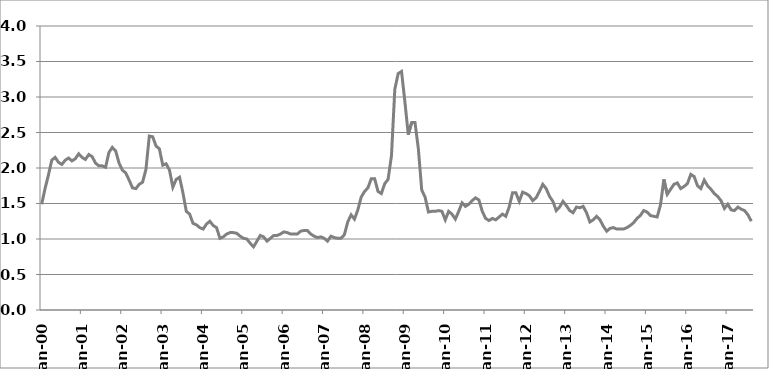
| Category | Series 1 |
|---|---|
| 2000-01-01 | 1.49 |
| 2000-02-01 | 1.71 |
| 2000-03-01 | 1.9 |
| 2000-04-01 | 2.11 |
| 2000-05-01 | 2.15 |
| 2000-06-01 | 2.08 |
| 2000-07-01 | 2.05 |
| 2000-08-01 | 2.11 |
| 2000-09-01 | 2.14 |
| 2000-10-01 | 2.1 |
| 2000-11-01 | 2.13 |
| 2000-12-01 | 2.2 |
| 2001-01-01 | 2.15 |
| 2001-02-01 | 2.12 |
| 2001-03-01 | 2.19 |
| 2001-04-01 | 2.16 |
| 2001-05-01 | 2.07 |
| 2001-06-01 | 2.03 |
| 2001-07-01 | 2.03 |
| 2001-08-01 | 2.01 |
| 2001-09-01 | 2.22 |
| 2001-10-01 | 2.29 |
| 2001-11-01 | 2.24 |
| 2001-12-01 | 2.07 |
| 2002-01-01 | 1.97 |
| 2002-02-01 | 1.93 |
| 2002-03-01 | 1.83 |
| 2002-04-01 | 1.72 |
| 2002-05-01 | 1.71 |
| 2002-06-01 | 1.77 |
| 2002-07-01 | 1.8 |
| 2002-08-01 | 1.98 |
| 2002-09-01 | 2.45 |
| 2002-10-01 | 2.44 |
| 2002-11-01 | 2.31 |
| 2002-12-01 | 2.27 |
| 2003-01-01 | 2.04 |
| 2003-02-01 | 2.06 |
| 2003-03-01 | 1.97 |
| 2003-04-01 | 1.73 |
| 2003-05-01 | 1.84 |
| 2003-06-01 | 1.87 |
| 2003-07-01 | 1.65 |
| 2003-08-01 | 1.39 |
| 2003-09-01 | 1.35 |
| 2003-10-01 | 1.22 |
| 2003-11-01 | 1.2 |
| 2003-12-01 | 1.16 |
| 2004-01-01 | 1.14 |
| 2004-02-01 | 1.21 |
| 2004-03-01 | 1.25 |
| 2004-04-01 | 1.19 |
| 2004-05-01 | 1.16 |
| 2004-06-01 | 1.01 |
| 2004-07-01 | 1.03 |
| 2004-08-01 | 1.07 |
| 2004-09-01 | 1.09 |
| 2004-10-01 | 1.09 |
| 2004-11-01 | 1.08 |
| 2004-12-01 | 1.04 |
| 2005-01-01 | 1.01 |
| 2005-02-01 | 1 |
| 2005-03-01 | 0.94 |
| 2005-04-01 | 0.89 |
| 2005-05-01 | 0.97 |
| 2005-06-01 | 1.05 |
| 2005-07-01 | 1.03 |
| 2005-08-01 | 0.97 |
| 2005-09-01 | 1.01 |
| 2005-10-01 | 1.05 |
| 2005-11-01 | 1.05 |
| 2005-12-01 | 1.07 |
| 2006-01-01 | 1.1 |
| 2006-02-01 | 1.09 |
| 2006-03-01 | 1.07 |
| 2006-04-01 | 1.07 |
| 2006-05-01 | 1.07 |
| 2006-06-01 | 1.11 |
| 2006-07-01 | 1.12 |
| 2006-08-01 | 1.12 |
| 2006-09-01 | 1.07 |
| 2006-10-01 | 1.04 |
| 2006-11-01 | 1.02 |
| 2006-12-01 | 1.03 |
| 2007-01-01 | 1.01 |
| 2007-02-01 | 0.97 |
| 2007-03-01 | 1.04 |
| 2007-04-01 | 1.02 |
| 2007-05-01 | 1.01 |
| 2007-06-01 | 1.01 |
| 2007-07-01 | 1.06 |
| 2007-08-01 | 1.24 |
| 2007-09-01 | 1.34 |
| 2007-10-01 | 1.28 |
| 2007-11-01 | 1.41 |
| 2007-12-01 | 1.59 |
| 2008-01-01 | 1.67 |
| 2008-02-01 | 1.72 |
| 2008-03-01 | 1.85 |
| 2008-04-01 | 1.85 |
| 2008-05-01 | 1.67 |
| 2008-06-01 | 1.64 |
| 2008-07-01 | 1.78 |
| 2008-08-01 | 1.84 |
| 2008-09-01 | 2.17 |
| 2008-10-01 | 3.11 |
| 2008-11-01 | 3.33 |
| 2008-12-01 | 3.36 |
| 2009-01-01 | 2.93 |
| 2009-02-01 | 2.47 |
| 2009-03-01 | 2.64 |
| 2009-04-01 | 2.64 |
| 2009-05-01 | 2.27 |
| 2009-06-01 | 1.69 |
| 2009-07-01 | 1.59 |
| 2009-08-01 | 1.38 |
| 2009-09-01 | 1.39 |
| 2009-10-01 | 1.39 |
| 2009-11-01 | 1.4 |
| 2009-12-01 | 1.39 |
| 2010-01-01 | 1.27 |
| 2010-02-01 | 1.39 |
| 2010-03-01 | 1.35 |
| 2010-04-01 | 1.28 |
| 2010-05-01 | 1.39 |
| 2010-06-01 | 1.51 |
| 2010-07-01 | 1.46 |
| 2010-08-01 | 1.49 |
| 2010-09-01 | 1.54 |
| 2010-10-01 | 1.58 |
| 2010-11-01 | 1.55 |
| 2010-12-01 | 1.39 |
| 2011-01-01 | 1.29 |
| 2011-02-01 | 1.26 |
| 2011-03-01 | 1.29 |
| 2011-04-01 | 1.27 |
| 2011-05-01 | 1.31 |
| 2011-06-01 | 1.35 |
| 2011-07-01 | 1.32 |
| 2011-08-01 | 1.45 |
| 2011-09-01 | 1.65 |
| 2011-10-01 | 1.65 |
| 2011-11-01 | 1.53 |
| 2011-12-01 | 1.66 |
| 2012-01-01 | 1.64 |
| 2012-02-01 | 1.61 |
| 2012-03-01 | 1.54 |
| 2012-04-01 | 1.58 |
| 2012-05-01 | 1.67 |
| 2012-06-01 | 1.77 |
| 2012-07-01 | 1.71 |
| 2012-08-01 | 1.6 |
| 2012-09-01 | 1.53 |
| 2012-10-01 | 1.4 |
| 2012-11-01 | 1.45 |
| 2012-12-01 | 1.53 |
| 2013-01-01 | 1.47 |
| 2013-02-01 | 1.4 |
| 2013-03-01 | 1.37 |
| 2013-04-01 | 1.45 |
| 2013-05-01 | 1.44 |
| 2013-06-01 | 1.46 |
| 2013-07-01 | 1.37 |
| 2013-08-01 | 1.24 |
| 2013-09-01 | 1.27 |
| 2013-10-01 | 1.32 |
| 2013-11-01 | 1.27 |
| 2013-12-01 | 1.18 |
| 2014-01-01 | 1.11 |
| 2014-02-01 | 1.15 |
| 2014-03-01 | 1.16 |
| 2014-04-01 | 1.14 |
| 2014-05-01 | 1.14 |
| 2014-06-01 | 1.14 |
| 2014-07-01 | 1.16 |
| 2014-08-01 | 1.19 |
| 2014-09-01 | 1.23 |
| 2014-10-01 | 1.29 |
| 2014-11-01 | 1.33 |
| 2014-12-01 | 1.4 |
| 2015-01-01 | 1.38 |
| 2015-02-01 | 1.33 |
| 2015-03-01 | 1.32 |
| 2015-04-01 | 1.31 |
| 2015-05-01 | 1.48 |
| 2015-06-01 | 1.84 |
| 2015-07-01 | 1.63 |
| 2015-08-01 | 1.7 |
| 2015-09-01 | 1.77 |
| 2015-10-01 | 1.79 |
| 2015-11-01 | 1.71 |
| 2015-12-01 | 1.74 |
| 2016-01-01 | 1.78 |
| 2016-02-01 | 1.91 |
| 2016-03-01 | 1.88 |
| 2016-04-01 | 1.75 |
| 2016-05-01 | 1.71 |
| 2016-06-01 | 1.83 |
| 2016-07-01 | 1.75 |
| 2016-08-01 | 1.7 |
| 2016-09-01 | 1.64 |
| 2016-10-01 | 1.6 |
| 2016-11-01 | 1.54 |
| 2016-12-01 | 1.43 |
| 2017-01-01 | 1.49 |
| 2017-02-01 | 1.41 |
| 2017-03-01 | 1.4 |
| 2017-04-01 | 1.45 |
| 2017-05-01 | 1.42 |
| 2017-06-01 | 1.4 |
| 2017-07-01 | 1.34 |
| 2017-08-01 | 1.25 |